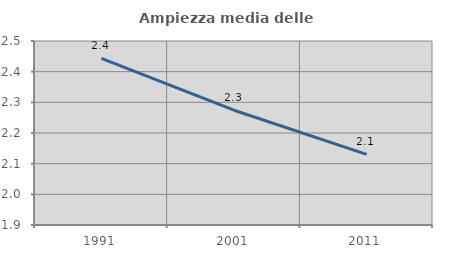
| Category | Ampiezza media delle famiglie |
|---|---|
| 1991.0 | 2.443 |
| 2001.0 | 2.274 |
| 2011.0 | 2.131 |